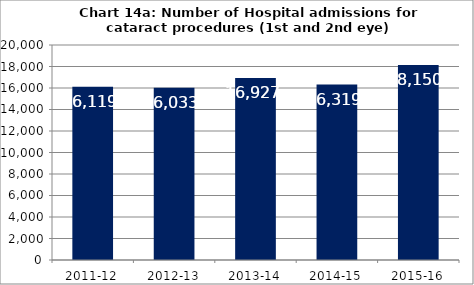
| Category | Chart 14a: Number of Hospital admissions for cataract procedures (1st and 2nd eye) |
|---|---|
| 2011-12 | 16119 |
| 2012-13 | 16033 |
| 2013-14 | 16927 |
| 2014-15 | 16319 |
| 2015-16 | 18150 |